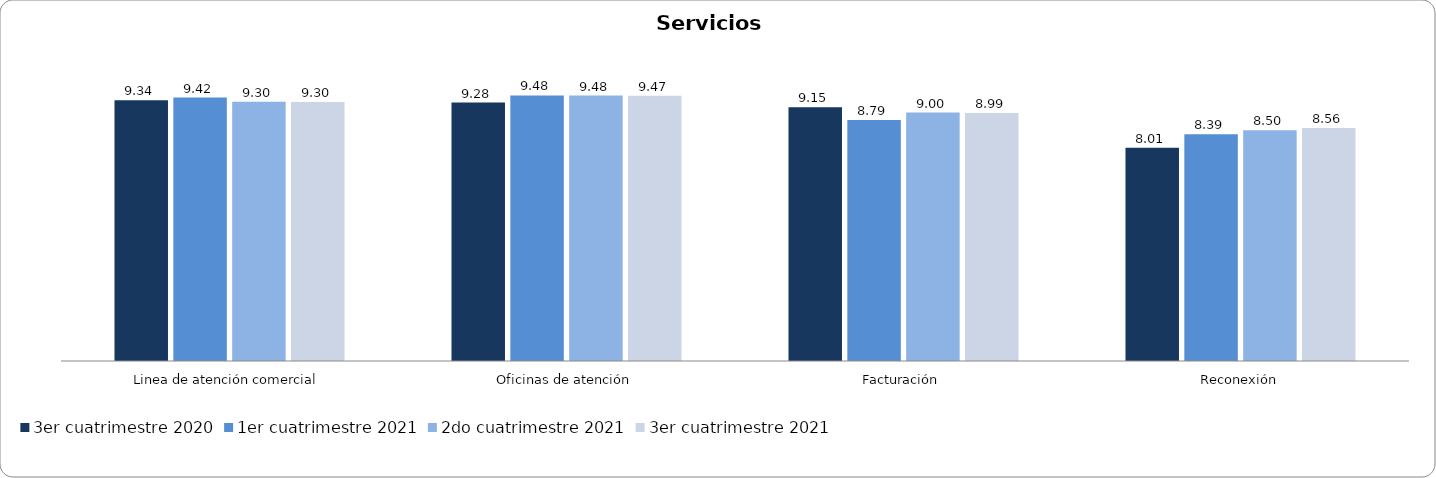
| Category | Septiembre - Octubre 2018 | Noviembre - Diciembre 2018 | 1er cuatrimestre 2019 | 2do cuatrimestre 2019 | 3er cuatrimestre 2019 | 3er cuatrimestre 2020 | 1er cuatrimestre 2021 | 2do cuatrimestre 2021 | 3er cuatrimestre 2021 |
|---|---|---|---|---|---|---|---|---|---|
| Linea de atención comercial |  |  |  |  |  |  | 9.419 | 9.302 | 9.296 |
| Oficinas de atención |  |  |  |  |  |  | 9.481 | 9.476 | 9.469 |
| Facturación |  |  |  |  |  |  | 8.786 | 8.999 | 8.986 |
| Reconexión |  |  |  |  |  |  | 8.386 | 8.501 | 8.564 |